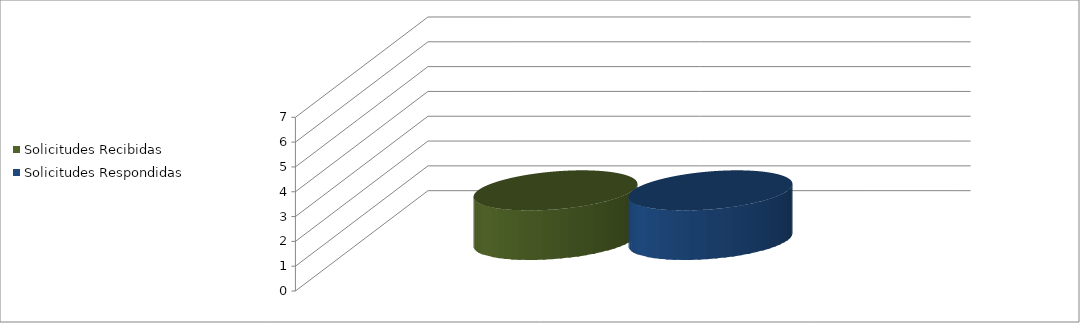
| Category | Solicitudes Recibidas | Solicitudes Respondidas |
|---|---|---|
| 0.0 | 2 | 2 |